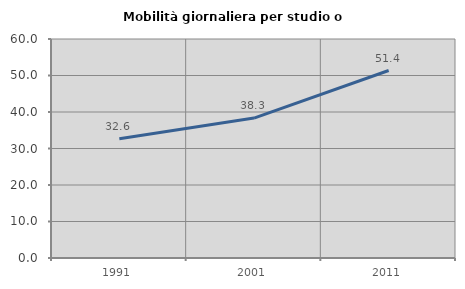
| Category | Mobilità giornaliera per studio o lavoro |
|---|---|
| 1991.0 | 32.645 |
| 2001.0 | 38.33 |
| 2011.0 | 51.364 |